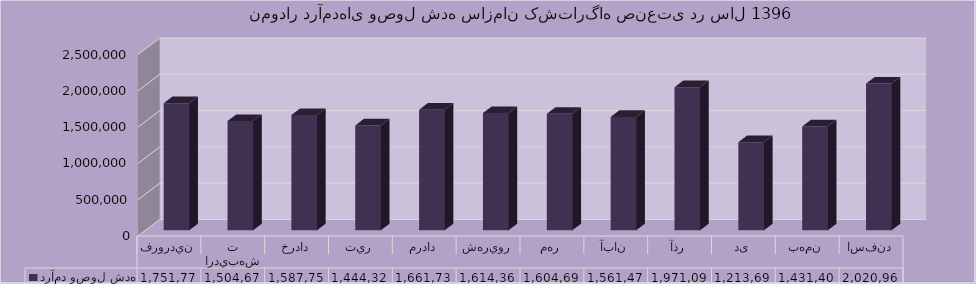
| Category | درآمد وصول شده |
|---|---|
| فروردين | 1751779 |
| ارديبهشت | 1504677 |
| خرداد | 1587759 |
| تير | 1444320 |
| مرداد | 1661737 |
| شهريور | 1614365 |
| مهر | 1604692 |
| آبان | 1561473 |
| آذر | 1971096 |
| دی | 1213695 |
| بهمن | 1431404 |
| اسفند | 2020962 |